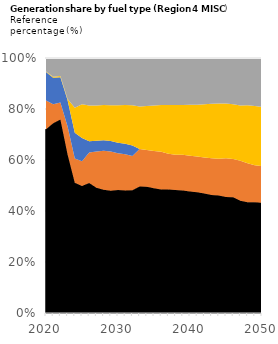
| Category | Coal | NG | Nuclear | Solar | Wind |
|---|---|---|---|---|---|
| 2020.0 | 116.093 | 18.161 | 17.897 | 0.319 | 8.567 |
| 2021.0 | 126.375 | 12.559 | 17.588 | 0.676 | 12.526 |
| 2022.0 | 137.035 | 11.964 | 17.854 | 0.924 | 12.747 |
| 2023.0 | 109.822 | 19.43 | 18.121 | 0.88 | 28.355 |
| 2024.0 | 92.14 | 17.148 | 18.121 | 17.613 | 35.212 |
| 2025.0 | 98.639 | 19.274 | 18.121 | 26.101 | 35.964 |
| 2026.0 | 99.575 | 23.352 | 8.519 | 27.324 | 36.454 |
| 2027.0 | 98.631 | 28.506 | 8.519 | 27.821 | 37.343 |
| 2028.0 | 99.203 | 31.401 | 8.519 | 28.21 | 37.885 |
| 2029.0 | 98.663 | 31.538 | 8.519 | 28.968 | 38.034 |
| 2030.0 | 98.909 | 29.611 | 8.519 | 30.148 | 38.025 |
| 2031.0 | 98.928 | 29.362 | 8.519 | 31.243 | 38.051 |
| 2032.0 | 98.835 | 27.44 | 8.519 | 32.321 | 38.051 |
| 2033.0 | 99.385 | 29.402 | 0 | 33.463 | 38.051 |
| 2034.0 | 99.902 | 29.145 | 0 | 34.89 | 38.042 |
| 2035.0 | 99.864 | 29.746 | 0 | 36.305 | 38.034 |
| 2036.0 | 99.826 | 30.494 | 0 | 37.827 | 38.017 |
| 2037.0 | 99.788 | 28.811 | 0 | 39.291 | 38.018 |
| 2038.0 | 99.751 | 28.551 | 0 | 40.232 | 38.196 |
| 2039.0 | 99.717 | 29.027 | 0 | 40.393 | 38.242 |
| 2040.0 | 99.302 | 29.186 | 0 | 41.55 | 38.24 |
| 2041.0 | 99.263 | 29.372 | 0 | 42.736 | 38.372 |
| 2042.0 | 99.231 | 29.953 | 0 | 44.269 | 38.4 |
| 2043.0 | 99.197 | 30.801 | 0 | 45.908 | 38.396 |
| 2044.0 | 99.158 | 31.158 | 0 | 46.621 | 38.402 |
| 2045.0 | 99.114 | 32.932 | 0 | 46.811 | 38.849 |
| 2046.0 | 99.073 | 32.682 | 0 | 46.943 | 39.518 |
| 2047.0 | 96.169 | 34.25 | 0 | 47.464 | 40.692 |
| 2048.0 | 96.123 | 33.707 | 0 | 50.376 | 40.905 |
| 2049.0 | 96.083 | 32.1 | 0 | 51.31 | 41.651 |
| 2050.0 | 96.036 | 32.226 | 0 | 51.55 | 42.676 |